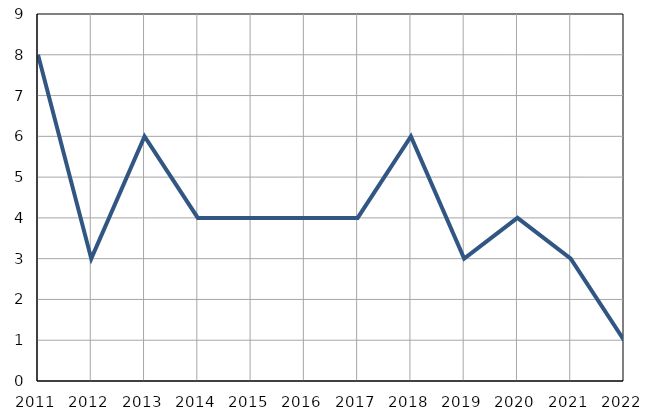
| Category | Infants
deaths |
|---|---|
| 2011.0 | 8 |
| 2012.0 | 3 |
| 2013.0 | 6 |
| 2014.0 | 4 |
| 2015.0 | 4 |
| 2016.0 | 4 |
| 2017.0 | 4 |
| 2018.0 | 6 |
| 2019.0 | 3 |
| 2020.0 | 4 |
| 2021.0 | 3 |
| 2022.0 | 1 |